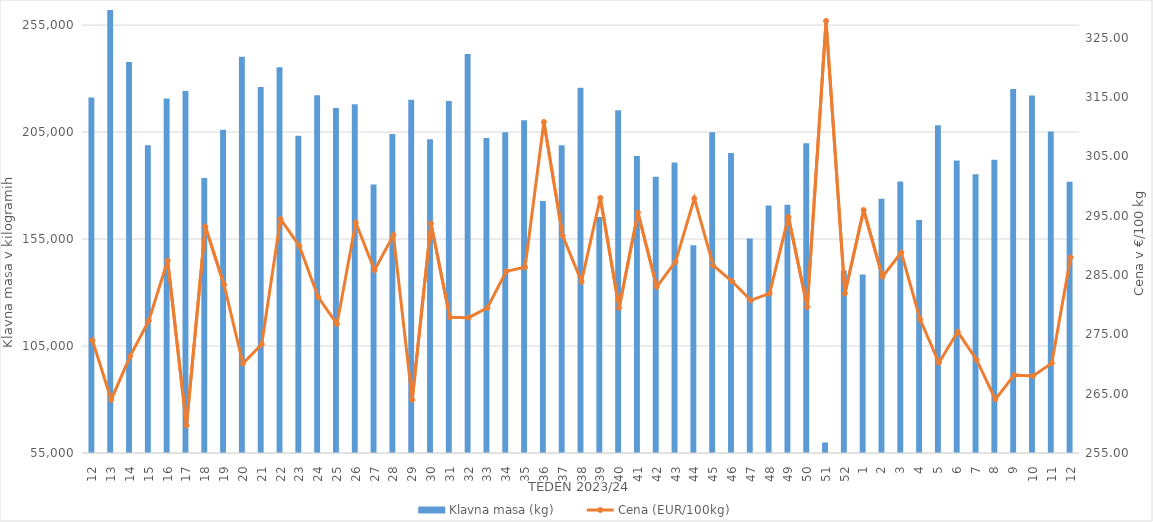
| Category | Klavna masa (kg) |
|---|---|
| 12.0 | 221171 |
| 13.0 | 262102 |
| 14.0 | 237813 |
| 15.0 | 198828 |
| 16.0 | 220686 |
| 17.0 | 224192 |
| 18.0 | 183508 |
| 19.0 | 206133 |
| 20.0 | 240223 |
| 21.0 | 226050 |
| 22.0 | 235273 |
| 23.0 | 203306 |
| 24.0 | 222178 |
| 25.0 | 216259 |
| 26.0 | 218064 |
| 27.0 | 180556 |
| 28.0 | 204078 |
| 29.0 | 220162 |
| 30.0 | 201649 |
| 31.0 | 219538 |
| 32.0 | 241549 |
| 33.0 | 202261 |
| 34.0 | 204903 |
| 35.0 | 210575 |
| 36.0 | 172745 |
| 37.0 | 198877 |
| 38.0 | 225730 |
| 39.0 | 165273 |
| 40.0 | 215175 |
| 41.0 | 193769 |
| 42.0 | 184122 |
| 43.0 | 190834 |
| 44.0 | 152119 |
| 45.0 | 204974 |
| 46.0 | 195179 |
| 47.0 | 155300 |
| 48.0 | 170687 |
| 49.0 | 171040 |
| 50.0 | 199802 |
| 51.0 | 59936 |
| 52.0 | 140361 |
| 1.0 | 138450 |
| 2.0 | 173833 |
| 3.0 | 181907 |
| 4.0 | 163901 |
| 5.0 | 208207 |
| 6.0 | 191770 |
| 7.0 | 185347 |
| 8.0 | 192049 |
| 9.0 | 225097 |
| 10.0 | 222116 |
| 11.0 | 205236 |
| 12.0 | 181756 |